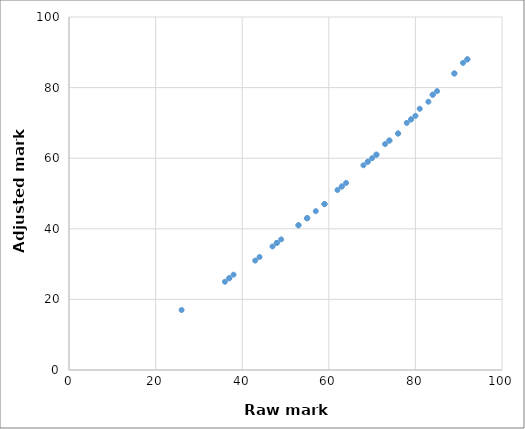
| Category | 71 |
|---|---|
| 69.0 | 59 |
| 43.0 | 31 |
| 74.0 | 65 |
| 68.0 | 58 |
| 44.0 | 32 |
| 70.0 | 60 |
| 85.0 | 79 |
| 63.0 | 52 |
| 89.0 | 84 |
| 36.0 | 25 |
| 89.0 | 84 |
| 69.0 | 59 |
| 84.0 | 78 |
| 79.0 | 71 |
| 79.0 | 71 |
| 53.0 | 41 |
| 71.0 | 61 |
| 81.0 | 74 |
| 48.0 | 36 |
| 59.0 | 47 |
| 57.0 | 45 |
| 73.0 | 64 |
| 55.0 | 43 |
| 80.0 | 72 |
| 26.0 | 17 |
| 83.0 | 76 |
| 59.0 | 47 |
| 74.0 | 65 |
| 59.0 | 47 |
| 49.0 | 37 |
| 63.0 | 52 |
| 37.0 | 26 |
| 76.0 | 67 |
| 38.0 | 27 |
| 78.0 | 70 |
| 55.0 | 43 |
| 91.0 | 87 |
| 48.0 | 36 |
| 37.0 | 26 |
| 47.0 | 35 |
| 92.0 | 88 |
| 84.0 | 78 |
| 53.0 | 41 |
| 92.0 | 88 |
| 62.0 | 51 |
| 76.0 | 67 |
| 55.0 | 43 |
| 64.0 | 53 |
| 71.0 | 61 |